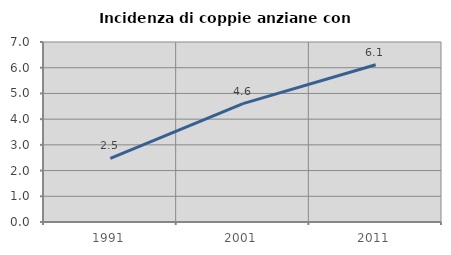
| Category | Incidenza di coppie anziane con figli |
|---|---|
| 1991.0 | 2.475 |
| 2001.0 | 4.602 |
| 2011.0 | 6.113 |